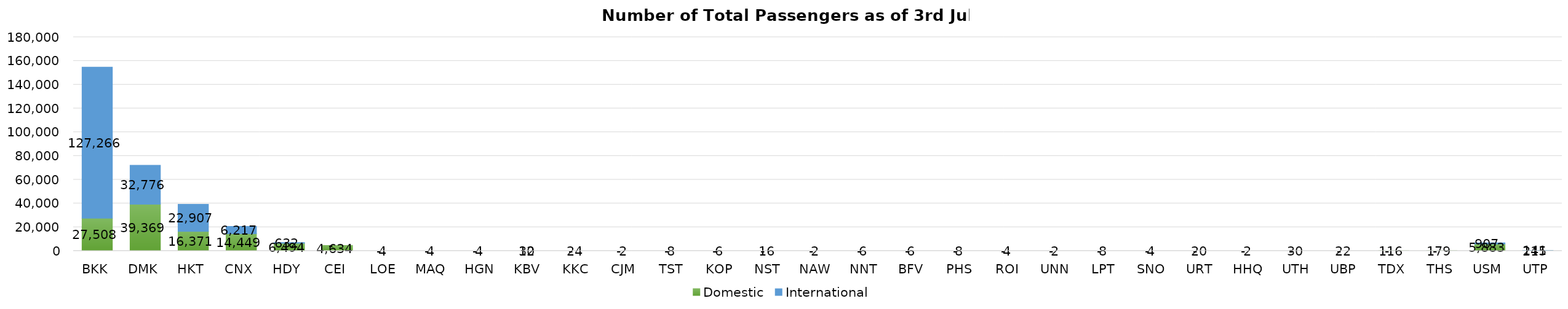
| Category | Domestic | International |
|---|---|---|
| BKK | 27508 | 127266 |
| DMK | 39369 | 32776 |
| HKT | 16371 | 22907 |
| CNX | 14449 | 6217 |
| HDY | 6494 | 632 |
| CEI | 4634 | 0 |
| LOE | 4 | 0 |
| MAQ | 4 | 0 |
| HGN | 4 | 0 |
| KBV | 32 | 10 |
| KKC | 24 | 0 |
| CJM | 2 | 0 |
| TST | 8 | 0 |
| KOP | 6 | 0 |
| NST | 16 | 0 |
| NAW | 2 | 0 |
| NNT | 6 | 0 |
| BFV | 6 | 0 |
| PHS | 8 | 0 |
| ROI | 4 | 0 |
| UNN | 2 | 0 |
| LPT | 8 | 0 |
| SNO | 4 | 0 |
| URT | 20 | 0 |
| HHQ | 2 | 0 |
| UTH | 30 | 0 |
| UBP | 22 | 0 |
| TDX | 116 | 0 |
| THS | 179 | 0 |
| USM | 5883 | 907 |
| UTP | 215 | 141 |